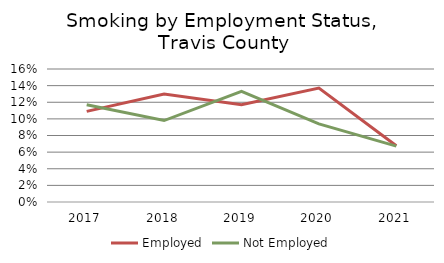
| Category | Employed | Not Employed |
|---|---|---|
| 2017.0 | 0.109 | 0.117 |
| 2018.0 | 0.13 | 0.098 |
| 2019.0 | 0.117 | 0.133 |
| 2020.0 | 0.137 | 0.094 |
| 2021.0 | 0.068 | 0.067 |